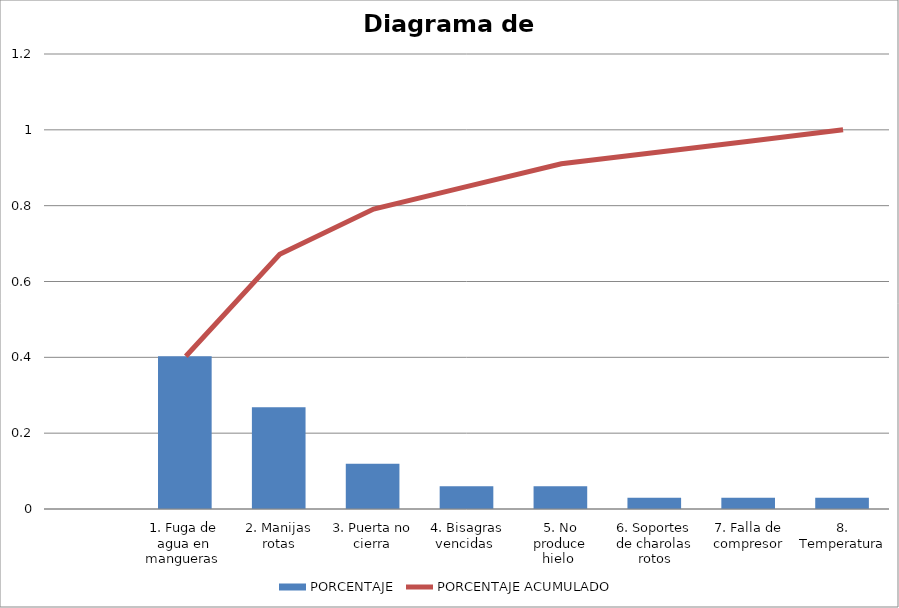
| Category | PORCENTAJE |
|---|---|
|  | 0 |
| 1. Fuga de agua en mangueras  | 0.403 |
| 2. Manijas rotas | 0.269 |
| 3. Puerta no cierra | 0.119 |
| 4. Bisagras vencidas  | 0.06 |
| 5. No produce hielo  | 0.06 |
| 6. Soportes de charolas rotos | 0.03 |
| 7. Falla de compresor | 0.03 |
| 8. Temperatura | 0.03 |